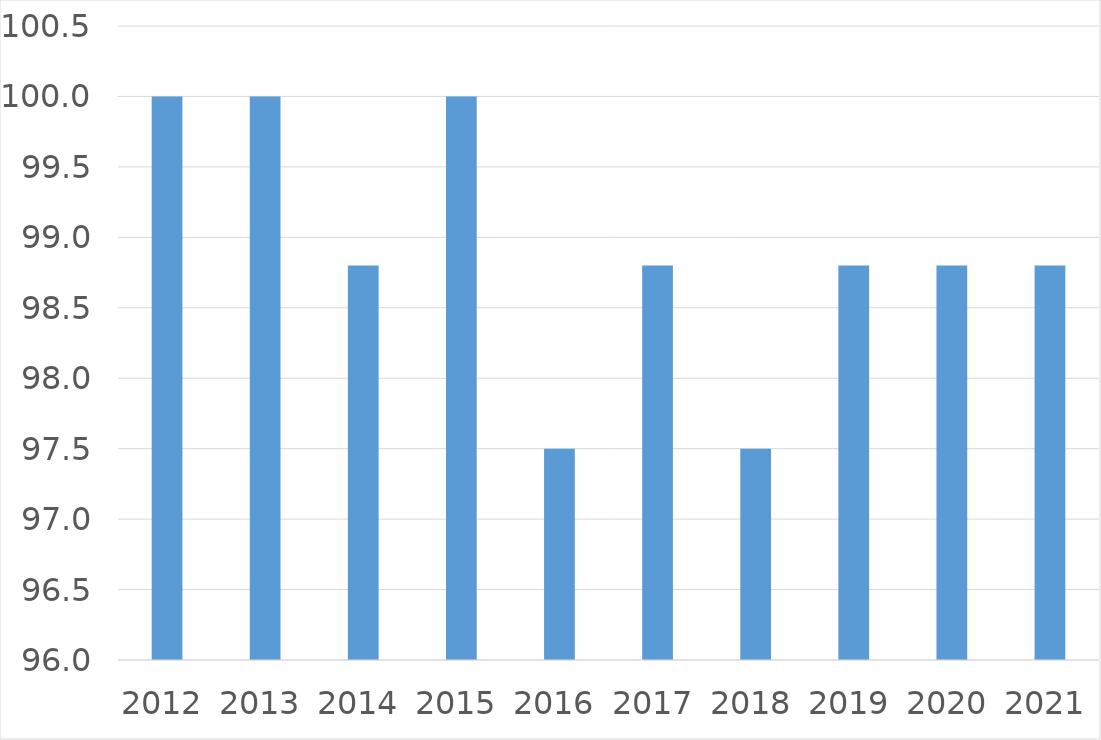
| Category | Series 0 |
|---|---|
| 2012 | 100 |
| 2013 | 100 |
| 2014 | 98.8 |
| 2015 | 100 |
| 2016 | 97.5 |
| 2017 | 98.8 |
| 2018 | 97.5 |
| 2019 | 98.8 |
| 2020 | 98.8 |
| 2021 | 98.8 |